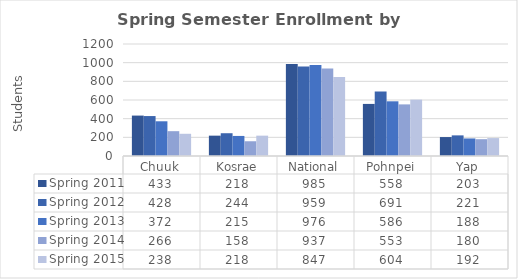
| Category | Spring 2011 | Spring 2012 | Spring 2013 | Spring 2014 | Spring 2015 |
|---|---|---|---|---|---|
| Chuuk | 433 | 428 | 372 | 266 | 238 |
| Kosrae | 218 | 244 | 215 | 158 | 218 |
| National | 985 | 959 | 976 | 937 | 847 |
| Pohnpei | 558 | 691 | 586 | 553 | 604 |
| Yap | 203 | 221 | 188 | 180 | 192 |